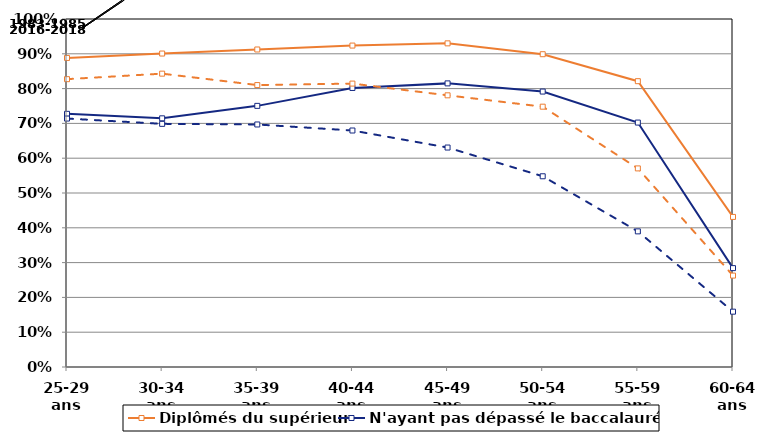
| Category | Diplômés du supérieur | N'ayant pas dépassé le baccalauréat* | Series 3 | Series 4 |
|---|---|---|---|---|
| 25-29 ans | 0.888 | 0.727 | 0.714 | 0.827 |
| 30-34 ans | 0.901 | 0.715 | 0.699 | 0.843 |
| 35-39 ans | 0.912 | 0.75 | 0.697 | 0.81 |
| 40-44 ans | 0.924 | 0.802 | 0.68 | 0.814 |
| 45-49 ans | 0.93 | 0.815 | 0.631 | 0.781 |
| 50-54 ans | 0.899 | 0.791 | 0.548 | 0.748 |
| 55-59 ans | 0.821 | 0.702 | 0.39 | 0.571 |
| 60-64 ans | 0.431 | 0.284 | 0.159 | 0.263 |